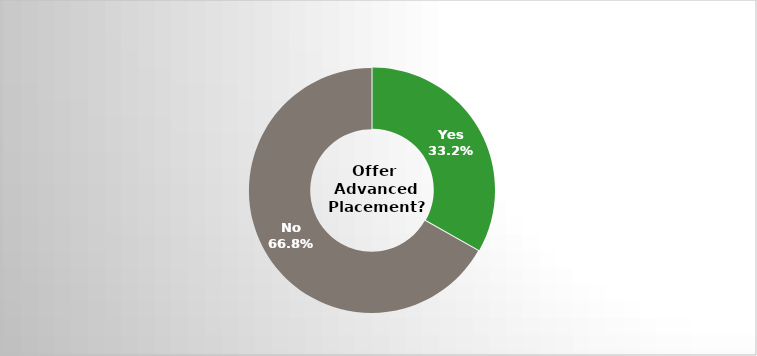
| Category | Series 0 |
|---|---|
| Yes | 0.332 |
| No | 0.668 |